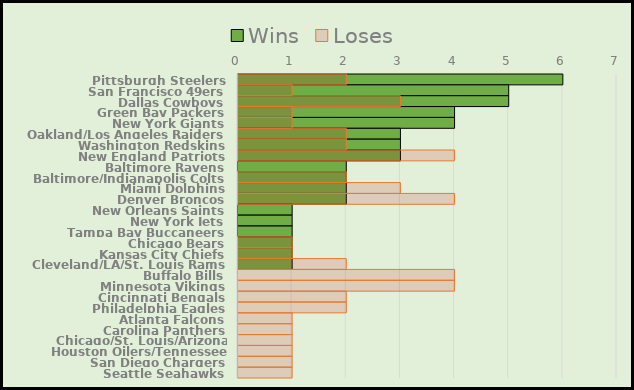
| Category | Wins | Loses |
|---|---|---|
| Pittsburgh Steelers | 6 | 2 |
| San Francisco 49ers | 5 | 1 |
| Dallas Cowboys | 5 | 3 |
| Green Bay Packers | 4 | 1 |
| New York Giants | 4 | 1 |
| Oakland/Los Angeles Raiders | 3 | 2 |
| Washington Redskins | 3 | 2 |
| New England Patriots | 3 | 4 |
| Baltimore Ravens | 2 | 0 |
| Baltimore/Indianapolis Colts | 2 | 2 |
| Miami Dolphins | 2 | 3 |
| Denver Broncos | 2 | 4 |
| New Orleans Saints | 1 | 0 |
| New York Jets | 1 | 0 |
| Tampa Bay Buccaneers | 1 | 0 |
| Chicago Bears | 1 | 1 |
| Kansas City Chiefs | 1 | 1 |
| Cleveland/LA/St. Louis Rams | 1 | 2 |
| Buffalo Bills | 0 | 4 |
| Minnesota Vikings | 0 | 4 |
| Cincinnati Bengals | 0 | 2 |
| Philadelphia Eagles | 0 | 2 |
| Atlanta Falcons | 0 | 1 |
| Carolina Panthers | 0 | 1 |
| Chicago/St. Louis/Arizona Cardinals | 0 | 1 |
| Houston Oilers/Tennessee Titans | 0 | 1 |
| San Diego Chargers | 0 | 1 |
| Seattle Seahawks | 0 | 1 |